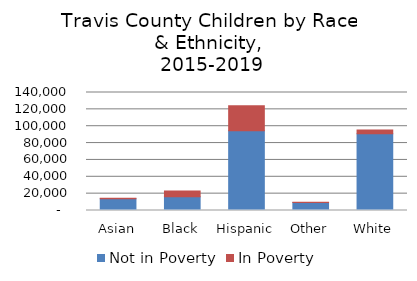
| Category | Not in Poverty | In Poverty |
|---|---|---|
| Asian | 13861 | 789 |
| Black | 16381 | 6617 |
| Hispanic | 94606 | 29692 |
| Other | 9581 | 310 |
| White | 91062 | 4346 |